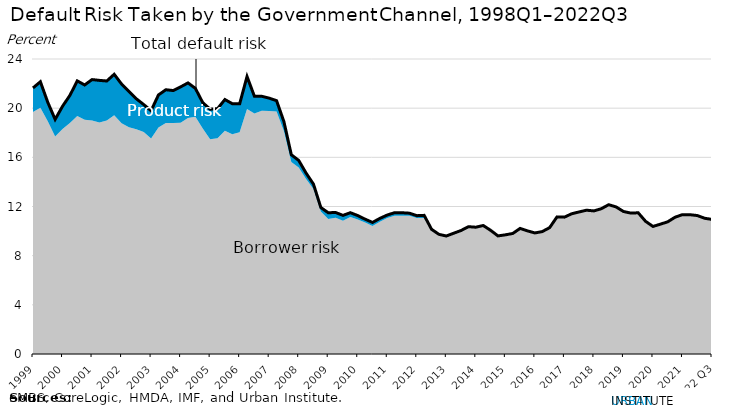
| Category | Series 2 |
|---|---|
| 1999 | 21.644 |
| 1999 | 22.15 |
| 2000 | 20.48 |
| 2000 | 19.085 |
| 2000 | 20.153 |
| 2000 | 21.041 |
| 2001 | 22.218 |
| 2001 | 21.887 |
| 2001 | 22.326 |
| 2001 | 22.261 |
| 2002 | 22.21 |
| 2002 | 22.756 |
| 2002 | 21.964 |
| 2002 | 21.365 |
| 2003 | 20.765 |
| 2003 | 20.293 |
| 2003 | 19.795 |
| 2003 | 21.076 |
| 2004 | 21.499 |
| 2004 | 21.434 |
| 2004 | 21.731 |
| 2004 | 22.055 |
| 2005 | 21.612 |
| 2005 | 20.449 |
| 2005 | 19.915 |
| 2005 | 19.957 |
| 2006 | 20.702 |
| 2006 | 20.366 |
| 2006 | 20.352 |
| 2006 | 22.574 |
| 2007 | 20.969 |
| 2007 | 20.966 |
| 2007 | 20.816 |
| 2007 | 20.612 |
| 2008 | 18.9 |
| 2008 | 16.212 |
| 2008 | 15.75 |
| 2008 | 14.72 |
| 2009 | 13.823 |
| 2009 | 11.918 |
| 2009 | 11.493 |
| 2009 | 11.512 |
| 2010 | 11.277 |
| 2010 | 11.496 |
| 2010 | 11.262 |
| 2010 | 10.969 |
| 2011 | 10.703 |
| 2011 | 11.034 |
| 2011 | 11.306 |
| 2011 | 11.499 |
| 2012 | 11.492 |
| 2012 | 11.457 |
| 2012 | 11.255 |
| 2012 | 11.279 |
| 2013 | 10.148 |
| 2013 | 9.735 |
| 2013 | 9.6 |
| 2013 | 9.826 |
| 2014 | 10.048 |
| 2014 | 10.359 |
| 2014 | 10.315 |
| 2014 | 10.455 |
| 2015 | 10.065 |
| 2015 | 9.607 |
| 2015 | 9.695 |
| 2015 | 9.805 |
| 2016 | 10.217 |
| 2016 | 10.017 |
| 2016 | 9.849 |
| 2016 | 9.96 |
| 2017 | 10.28 |
| 2017 | 11.154 |
| 2017 | 11.134 |
| 2017 | 11.411 |
| 2018 | 11.558 |
| 2018 | 11.7 |
| 2018 | 11.641 |
| 2018 | 11.82 |
| 2019 | 12.146 |
| 2019 | 11.968 |
| 2019 | 11.595 |
| 2019 | 11.463 |
| 2020 | 11.488 |
| 2020 | 10.795 |
| 2020 | 10.377 |
| 2020 | 10.561 |
| 2021 | 10.755 |
| 2021 | 11.13 |
| 2021 | 11.338 |
| 2021 | 11.333 |
| 2022 Q1 | 11.265 |
| 2022 Q2 | 11.045 |
| 2022 Q3 | 10.947 |